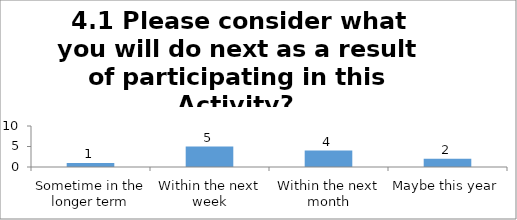
| Category | 4.1 Please consider what you will do next as a result of participating in this Activity? 
I will share with my students about these topics. |
|---|---|
| Sometime in the longer term | 1 |
| Within the next week | 5 |
| Within the next month | 4 |
| Maybe this year | 2 |